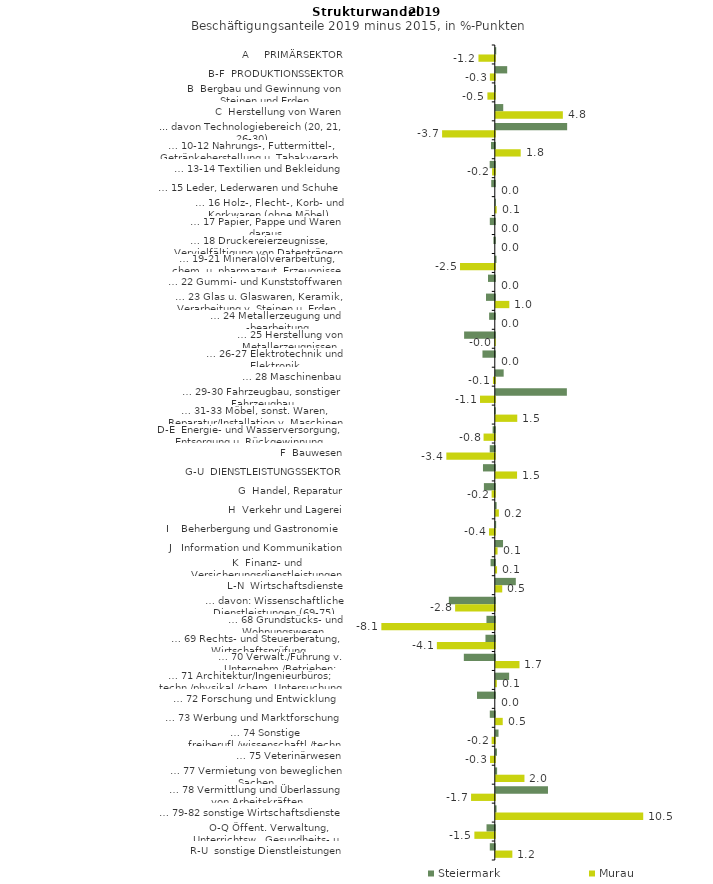
| Category | Steiermark | Murau |
|---|---|---|
| A     PRIMÄRSEKTOR | 0.031 | -1.161 |
| B-F  PRODUKTIONSSEKTOR | 0.809 | -0.349 |
| B  Bergbau und Gewinnung von Steinen und Erden | -0.014 | -0.526 |
| C  Herstellung von Waren | 0.528 | 4.763 |
| ... davon Technologiebereich (20, 21, 26-30) | 5.068 | -3.743 |
| … 10-12 Nahrungs-, Futtermittel-, Getränkeherstellung u. Tabakverarb. | -0.269 | 1.769 |
| … 13-14 Textilien und Bekleidung | -0.363 | -0.192 |
| … 15 Leder, Lederwaren und Schuhe | -0.253 | 0 |
| … 16 Holz-, Flecht-, Korb- und Korkwaren (ohne Möbel)  | 0.005 | 0.064 |
| … 17 Papier, Pappe und Waren daraus  | -0.355 | 0 |
| … 18 Druckereierzeugnisse, Vervielfältigung von Datenträgern | -0.098 | 0 |
| … 19-21 Mineralölverarbeitung, chem. u. pharmazeut. Erzeugnisse | 0.048 | -2.47 |
| … 22 Gummi- und Kunststoffwaren | -0.484 | 0 |
| … 23 Glas u. Glaswaren, Keramik, Verarbeitung v. Steinen u. Erden  | -0.625 | 0.96 |
| … 24 Metallerzeugung und -bearbeitung | -0.403 | 0 |
| … 25 Herstellung von Metallerzeugnissen  | -2.18 | -0.025 |
| … 26-27 Elektrotechnik und Elektronik | -0.876 | 0 |
| … 28 Maschinenbau | 0.559 | -0.133 |
| … 29-30 Fahrzeugbau, sonstiger Fahrzeugbau | 5.047 | -1.051 |
| … 31-33 Möbel, sonst. Waren, Reparatur/Installation v. Maschinen | -0.041 | 1.524 |
| D-E  Energie- und Wasserversorgung, Entsorgung u. Rückgewinnung | -0.153 | -0.798 |
| F  Bauwesen | -0.36 | -3.441 |
| G-U  DIENSTLEISTUNGSSEKTOR | -0.84 | 1.51 |
| G  Handel, Reparatur | -0.775 | -0.226 |
| H  Verkehr und Lagerei | 0.059 | 0.218 |
| I    Beherbergung und Gastronomie | 0.026 | -0.411 |
| J   Information und Kommunikation | 0.514 | 0.124 |
| K  Finanz- und Versicherungsdienstleistungen | -0.301 | 0.09 |
| L-N  Wirtschaftsdienste | 1.421 | 0.457 |
| … davon: Wissenschaftliche Dienstleistungen (69-75) | -3.263 | -2.818 |
| … 68 Grundstücks- und Wohnungswesen  | -0.593 | -8.057 |
| … 69 Rechts- und Steuerberatung, Wirtschaftsprüfung | -0.663 | -4.115 |
| … 70 Verwalt./Führung v. Unternehm./Betrieben; Unternehmensberat. | -2.199 | 1.681 |
| … 71 Architektur/Ingenieurbüros; techn./physikal./chem. Untersuchung | 0.947 | 0.074 |
| … 72 Forschung und Entwicklung  | -1.265 | 0 |
| … 73 Werbung und Marktforschung | -0.356 | 0.493 |
| … 74 Sonstige freiberufl./wissenschaftl./techn. Tätigkeiten | 0.194 | -0.226 |
| … 75 Veterinärwesen | 0.081 | -0.339 |
| … 77 Vermietung von beweglichen Sachen  | 0.093 | 2.036 |
| … 78 Vermittlung und Überlassung von Arbeitskräften | 3.706 | -1.686 |
| … 79-82 sonstige Wirtschaftsdienste | 0.053 | 10.47 |
| O-Q Öffent. Verwaltung, Unterrichtsw., Gesundheits- u. Sozialwesen | -0.588 | -1.451 |
| R-U  sonstige Dienstleistungen | -0.356 | 1.176 |